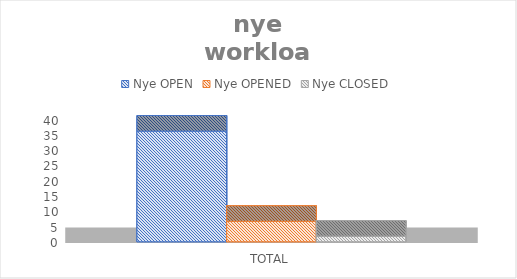
| Category | Nye |
|---|---|
| TOTAL | 1.831 |